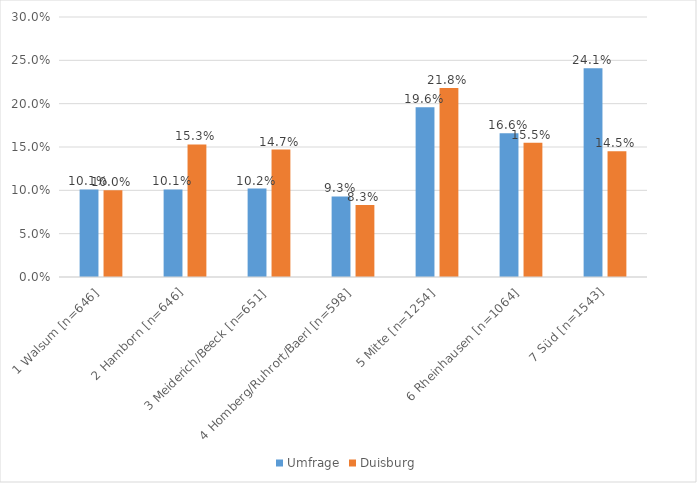
| Category | Umfrage | Duisburg |
|---|---|---|
| 1 Walsum [n=646] | 0.101 | 0.1 |
| 2 Hamborn [n=646] | 0.101 | 0.153 |
| 3 Meiderich/Beeck [n=651] | 0.102 | 0.147 |
| 4 Homberg/Ruhrort/Baerl [n=598] | 0.093 | 0.083 |
| 5 Mitte [n=1254] | 0.196 | 0.218 |
| 6 Rheinhausen [n=1064] | 0.166 | 0.155 |
| 7 Süd [n=1543] | 0.241 | 0.145 |